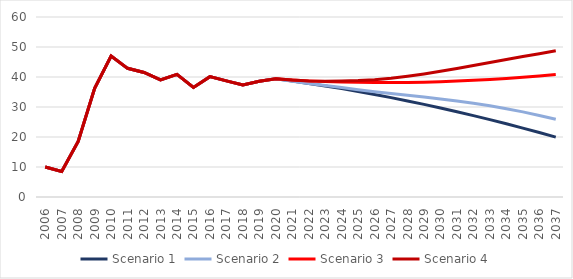
| Category | Scenario 1 | Scenario 2 | Scenario 3 | Scenario 4 |
|---|---|---|---|---|
| 2006 | 10.012 | 10.012 | 10.012 | 10.012 |
| 2007 | 8.507 | 8.507 | 8.507 | 8.507 |
| 2008 | 18.523 | 18.523 | 18.523 | 18.523 |
| 2009 | 36.251 | 36.251 | 36.251 | 36.251 |
| 2010 | 46.992 | 46.992 | 46.992 | 46.992 |
| 2011 | 42.89 | 42.89 | 42.89 | 42.89 |
| 2012 | 41.516 | 41.516 | 41.516 | 41.516 |
| 2013 | 39.027 | 39.027 | 39.027 | 39.027 |
| 2014 | 40.879 | 40.879 | 40.879 | 40.879 |
| 2015 | 36.518 | 36.518 | 36.518 | 36.518 |
| 2016 | 40.119 | 40.119 | 40.119 | 40.119 |
| 2017 | 38.716 | 38.716 | 38.716 | 38.716 |
| 2018 | 37.349 | 37.349 | 37.349 | 37.349 |
| 2019 | 38.588 | 38.588 | 38.588 | 38.588 |
| 2020 | 39.4 | 39.4 | 39.4 | 39.4 |
| 2021 | 38.651 | 38.595 | 39.026 | 38.97 |
| 2022 | 37.831 | 37.84 | 38.699 | 38.708 |
| 2023 | 37.016 | 37.144 | 38.491 | 38.622 |
| 2024 | 36.132 | 36.472 | 38.328 | 38.679 |
| 2025 | 35.184 | 35.75 | 38.21 | 38.801 |
| 2026 | 34.183 | 35.084 | 38.148 | 39.103 |
| 2027 | 33.131 | 34.47 | 38.14 | 39.585 |
| 2028 | 32.028 | 33.904 | 38.186 | 40.249 |
| 2029 | 30.875 | 33.315 | 38.285 | 41.02 |
| 2030 | 29.674 | 32.703 | 38.434 | 41.901 |
| 2031 | 28.424 | 32.016 | 38.635 | 42.832 |
| 2032 | 27.127 | 31.253 | 38.884 | 43.807 |
| 2033 | 25.784 | 30.398 | 39.182 | 44.807 |
| 2034 | 24.395 | 29.437 | 39.528 | 45.807 |
| 2035 | 22.96 | 28.369 | 39.92 | 46.8 |
| 2036 | 21.482 | 27.192 | 40.358 | 47.776 |
| 2037 | 19.959 | 25.933 | 40.841 | 48.774 |